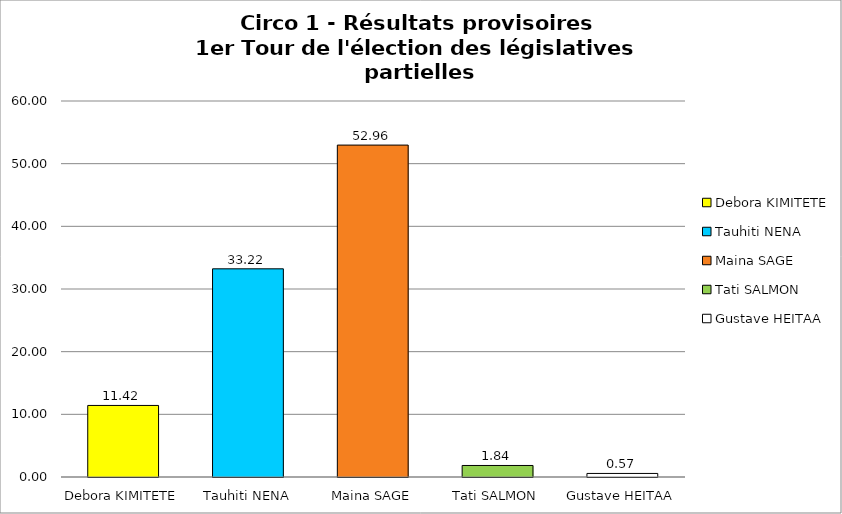
| Category | Series 0 |
|---|---|
| Debora KIMITETE | 11.418 |
| Tauhiti NENA | 33.219 |
| Maina SAGE | 52.964 |
| Tati SALMON | 1.838 |
| Gustave HEITAA | 0.568 |